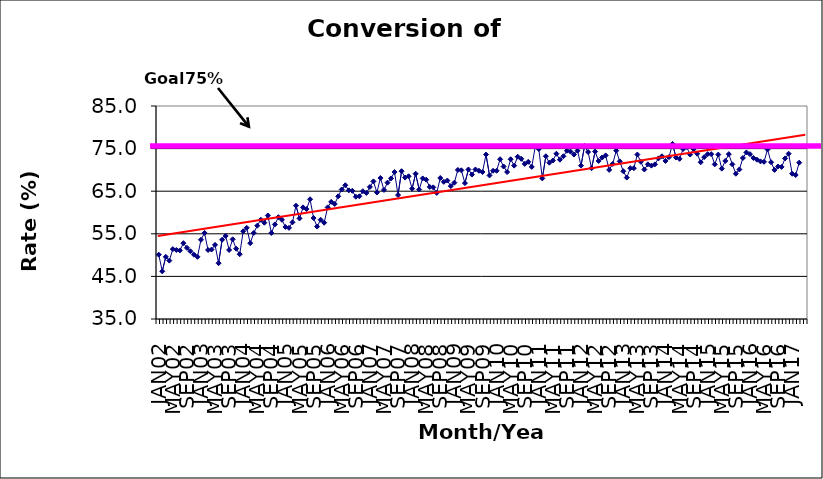
| Category | Series 0 |
|---|---|
| JAN02 | 50.1 |
| FEB02 | 46.2 |
| MAR02 | 49.6 |
| APR02 | 48.7 |
| MAY02 | 51.4 |
| JUN02 | 51.2 |
| JUL02 | 51.1 |
| AUG02 | 52.8 |
| SEP02 | 51.7 |
| OCT02 | 50.9 |
| NOV02 | 50.1 |
| DEC02 | 49.6 |
| JAN03 | 53.6 |
| FEB03 | 55.2 |
| MAR03 | 51.2 |
| APR03 | 51.3 |
| MAY03 | 52.4 |
| JUN03 | 48.1 |
| JUL03 | 53.6 |
| AUG03 | 54.5 |
| SEP03 | 51.2 |
| OCT03 | 53.7 |
| NOV03 | 51.5 |
| DEC03 | 50.2 |
| JAN04 | 55.6 |
| FEB04 | 56.4 |
| MAR04 | 52.8 |
| APR04 | 55.2 |
| MAY04 | 56.9 |
| JUN04 | 58.3 |
| JUL04 | 57.6 |
| AUG04 | 59.3 |
| SEP04 | 55.2 |
| OCT04 | 57.2 |
| NOV04 | 58.9 |
| DEC04 | 58.3 |
| JAN05 | 56.6 |
| FEB05 | 56.4 |
| MAR05 | 57.7 |
| APR05 | 61.6 |
| MAY05 | 58.6 |
| JUN05 | 61.2 |
| JUL05 | 60.8 |
| AUG05 | 63.1 |
| SEP05 | 58.7 |
| OCT05 | 56.7 |
| NOV05 | 58.3 |
| DEC05 | 57.6 |
| JAN06 | 61.2 |
| FEB06 | 62.5 |
| MAR06 | 62 |
| APR06 | 63.8 |
| MAY06 | 65.4 |
| JUN06 | 66.4 |
| JUL06 | 65.2 |
| AUG06 | 65.1 |
| SEP06 | 63.7 |
| OCT06 | 63.8 |
| NOV06 | 65 |
| DEC06 | 64.6 |
| JAN07 | 66 |
| FEB07 | 67.3 |
| MAR07 | 64.7 |
| APR07 | 68.1 |
| MAY07 | 65.3 |
| JUN07 | 67 |
| JUL07 | 68 |
| AUG07 | 69.5 |
| SEP07 | 64.1 |
| OCT07 | 69.7 |
| NOV07 | 68.2 |
| DEC07 | 68.5 |
| JAN08 | 65.6 |
| FEB08 | 69.1 |
| MAR08 | 65.4 |
| APR08 | 68 |
| MAY08 | 67.7 |
| JUN08 | 66 |
| JUL08 | 65.9 |
| AUG08 | 64.6 |
| SEP08 | 68.1 |
| OCT08 | 67.2 |
| NOV08 | 67.5 |
| DEC08 | 66.2 |
| JAN09 | 67 |
| FEB09 | 70 |
| MAR09 | 69.9 |
| APR09 | 66.9 |
| MAY09 | 70.1 |
| JUN09 | 68.9 |
| JUL09 | 70.1 |
| AUG09 | 69.8 |
| SEP09 | 69.5 |
| OCT09 | 73.6 |
| NOV09 | 68.7 |
| DEC09 | 69.8 |
| JAN10 | 69.8 |
| FEB10 | 72.5 |
| MAR10 | 70.8 |
| APR10 | 69.5 |
| MAY10 | 72.5 |
| JUN10 | 71 |
| JUL10 | 73.1 |
| AUG10 | 72.6 |
| SEP10 | 71.4 |
| OCT10 | 71.9 |
| NOV10 | 70.7 |
| DEC10 | 75.5 |
| JAN11 | 74.9 |
| FEB11 | 68 |
| MAR11 | 73.2 |
| APR11 | 71.7 |
| MAY11 | 72.2 |
| JUN11 | 73.8 |
| JUL11 | 72.4 |
| AUG11 | 73.2 |
| SEP11 | 74.5 |
| OCT11 | 74.3 |
| NOV11 | 73.6 |
| DEC11 | 74.5 |
| JAN12 | 71 |
| FEB12 | 75.6 |
| MAR12 | 74.2 |
| APR12 | 70.4 |
| MAY12 | 74.3 |
| JUN12 | 72.1 |
| JUL12 | 72.9 |
| AUG12 | 73.4 |
| SEP12 | 70 |
| OCT12 | 71.4 |
| NOV12 | 74.5 |
| DEC12 | 72 |
| JAN13 | 69.7 |
| FEB13 | 68.2 |
| MAR13 | 70.4 |
| APR13 | 70.4 |
| MAY13 | 73.6 |
| JUN13 | 71.9 |
| JUL13 | 70.1 |
| AUG13 | 71.3 |
| SEP13 | 71 |
| OCT13 | 71.3 |
| NOV13 | 72.7 |
| DEC13 | 73.2 |
| JAN14 | 72.1 |
| FEB14 | 73 |
| MAR14 | 76.1 |
| APR14 | 72.9 |
| MAY14 | 72.6 |
| JUN14 | 74.9 |
| JUL14 | 75.4 |
| AUG14 | 73.6 |
| SEP14 | 74.9 |
| OCT14 | 73.8 |
| NOV14 | 71.8 |
| DEC14 | 73 |
| JAN15 | 73.7 |
| FEB15 | 73.7 |
| MAR15 | 71.3 |
| APR15 | 73.6 |
| MAY15 | 70.3 |
| JUN15 | 72.1 |
| JUL15 | 73.7 |
| AUG15 | 71.3 |
| SEP15 | 69.1 |
| OCT15 | 70.1 |
| NOV15 | 72.8 |
| DEC15 | 74.1 |
| JAN16 | 73.7 |
| FEB16 | 72.8 |
| MAR16 | 72.4 |
| APR16 | 72 |
| MAY16 | 71.9 |
| JUN16 | 74.8 |
| JUL16 | 71.8 |
| AUG16 | 70 |
| SEP16 | 70.8 |
| OCT16 | 70.7 |
| NOV16 | 72.7 |
| DEC16 | 73.8 |
| JAN17 | 69.1 |
| FEB17 | 68.8 |
| MAR17 | 71.7 |